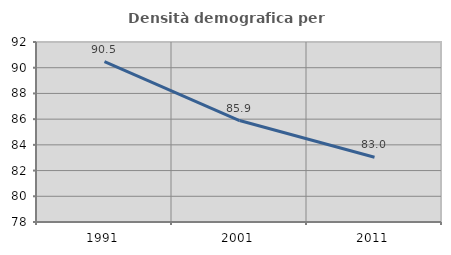
| Category | Densità demografica |
|---|---|
| 1991.0 | 90.479 |
| 2001.0 | 85.889 |
| 2011.0 | 83.038 |